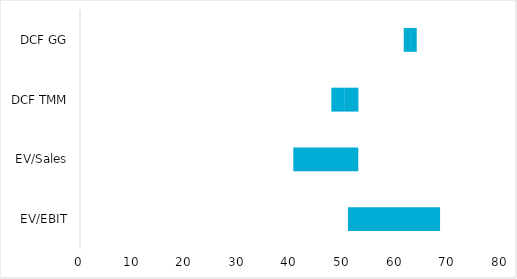
| Category | Min | Q1 | Med | Q3 | Max |
|---|---|---|---|---|---|
| EV/EBIT | 24.82 | 6.517 | 7.386 | 12.188 | 17.511 |
| EV/Sales | 1.81 | 14.331 | 11.492 | 12.894 | 12.352 |
| DCF TMM | 42.608 | 2.575 | 2.575 | 2.575 | 2.575 |
| DCF GG | 59.244 | 1.112 | 1.159 | 1.21 | 1.264 |